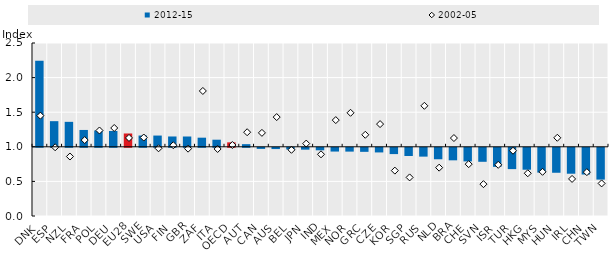
| Category | 2012-15 |
|---|---|
| DNK | 2.243 |
| ESP | 1.37 |
| NZL | 1.361 |
| FRA | 1.243 |
| POL | 1.236 |
| DEU | 1.229 |
| EU28 | 1.192 |
| SWE | 1.163 |
| USA | 1.162 |
| FIN | 1.149 |
| GBR | 1.149 |
| ZAF | 1.132 |
| ITA | 1.103 |
| OECD | 1.064 |
| AUT | 1.038 |
| CAN | 0.984 |
| AUS | 0.982 |
| BEL | 0.976 |
| JPN | 0.973 |
| IND | 0.964 |
| MEX | 0.946 |
| NOR | 0.945 |
| GRC | 0.942 |
| CZE | 0.933 |
| KOR | 0.909 |
| SGP | 0.881 |
| RUS | 0.872 |
| NLD | 0.834 |
| BRA | 0.819 |
| CHE | 0.804 |
| SVN | 0.798 |
| ISR | 0.724 |
| TUR | 0.692 |
| HKG | 0.683 |
| MYS | 0.641 |
| HUN | 0.639 |
| IRL | 0.625 |
| CHN | 0.614 |
| TWN | 0.541 |